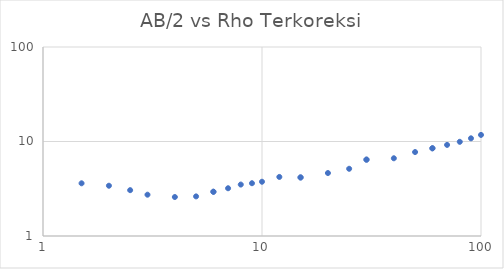
| Category | Series 0 |
|---|---|
| 1.5 | 3.612 |
| 2.0 | 3.404 |
| 2.5 | 3.055 |
| 3.0 | 2.736 |
| 4.0 | 2.585 |
| 5.0 | 2.625 |
| 6.0 | 2.94 |
| 6.0 | 2.94 |
| 7.0 | 3.201 |
| 8.0 | 3.502 |
| 9.0 | 3.618 |
| 10.0 | 3.751 |
| 12.0 | 4.217 |
| 15.0 | 4.165 |
| 15.0 | 4.165 |
| 20.0 | 4.638 |
| 25.0 | 5.144 |
| 30.0 | 6.43 |
| 30.0 | 6.43 |
| 40.0 | 6.646 |
| 50.0 | 7.734 |
| 60.0 | 8.474 |
| 60.0 | 8.474 |
| 70.0 | 9.205 |
| 80.0 | 9.925 |
| 90.0 | 10.808 |
| 100.0 | 11.744 |